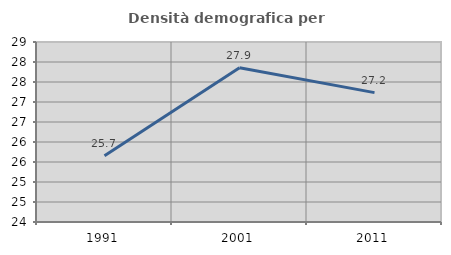
| Category | Densità demografica |
|---|---|
| 1991.0 | 25.654 |
| 2001.0 | 27.858 |
| 2011.0 | 27.234 |